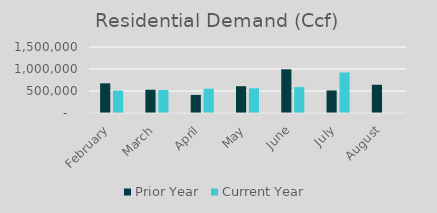
| Category | Prior Year | Current Year |
|---|---|---|
| February | 674439.428 | 510296.309 |
| March | 528549.791 | 521893.674 |
| April | 411179.62 | 552550.404 |
| May | 608563.54 | 561680.927 |
| June | 993563.54 | 588815.728 |
| July | 512849.55 | 920418.723 |
| August | 641515.25 | 0 |